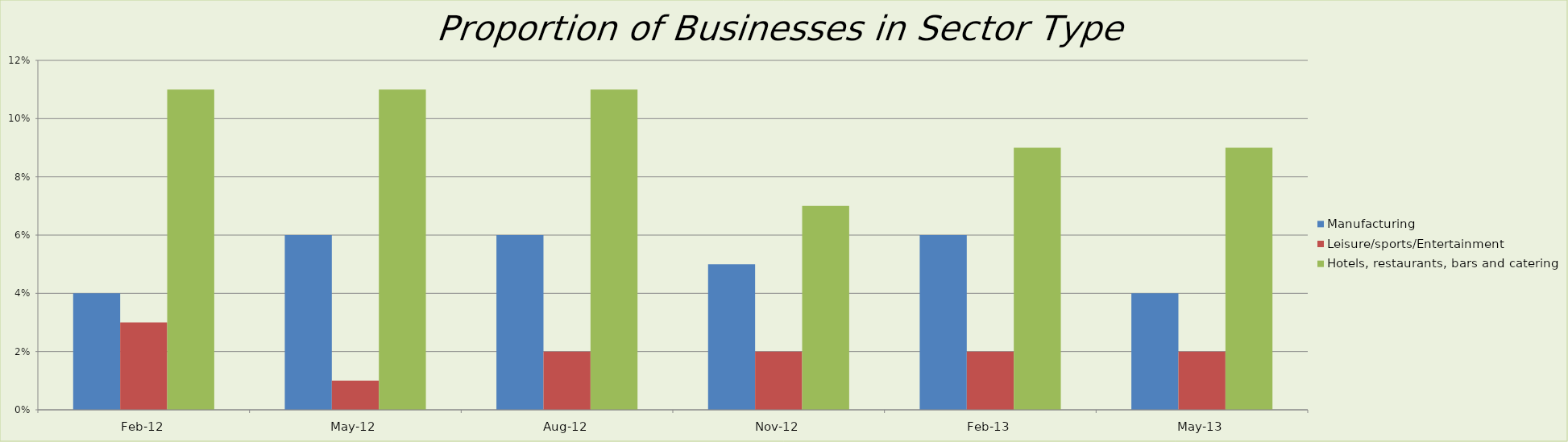
| Category | Manufacturing | Leisure/sports/Entertainment | Hotels, restaurants, bars and catering |
|---|---|---|---|
| 2012-02-01 | 0.04 | 0.03 | 0.11 |
| 2012-05-01 | 0.06 | 0.01 | 0.11 |
| 2012-08-01 | 0.06 | 0.02 | 0.11 |
| 2012-11-01 | 0.05 | 0.02 | 0.07 |
| 2013-02-01 | 0.06 | 0.02 | 0.09 |
| 2013-05-01 | 0.04 | 0.02 | 0.09 |